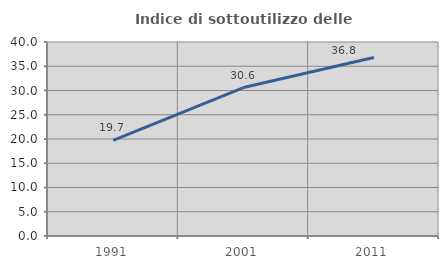
| Category | Indice di sottoutilizzo delle abitazioni  |
|---|---|
| 1991.0 | 19.697 |
| 2001.0 | 30.611 |
| 2011.0 | 36.805 |